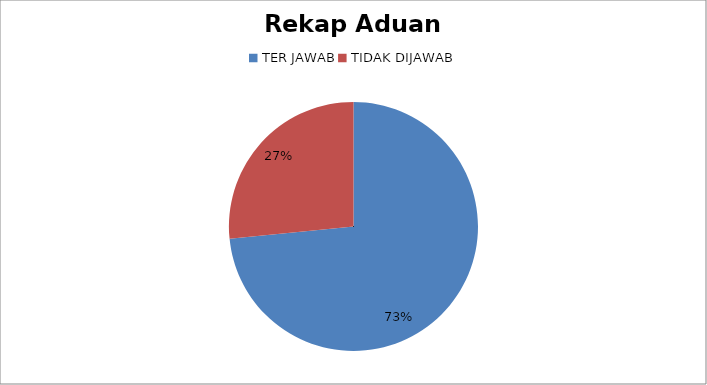
| Category | Series 0 |
|---|---|
| TER JAWAB | 94 |
| TIDAK DIJAWAB | 34 |